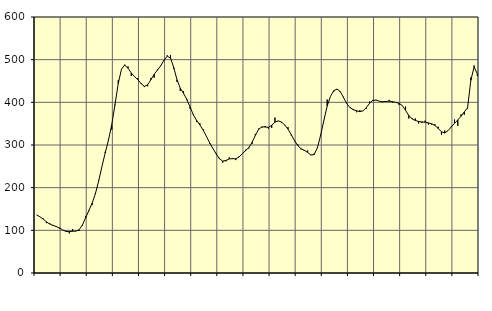
| Category | Piggar | Series 1 |
|---|---|---|
| nan | 136.1 | 135.94 |
| 87.0 | 131.9 | 131.87 |
| 87.0 | 127.9 | 126.28 |
| 87.0 | 116.8 | 119.91 |
| nan | 116.7 | 114.82 |
| 88.0 | 110.3 | 111.72 |
| 88.0 | 110.1 | 108.84 |
| 88.0 | 103.7 | 105.51 |
| nan | 101 | 100.97 |
| 89.0 | 98.9 | 97.38 |
| 89.0 | 92.9 | 96.98 |
| 89.0 | 103.1 | 97.82 |
| nan | 97.5 | 98.11 |
| 90.0 | 98.5 | 101.14 |
| 90.0 | 111.1 | 112.34 |
| 90.0 | 133.8 | 129.44 |
| nan | 147.4 | 146.35 |
| 91.0 | 159.2 | 163.51 |
| 91.0 | 187.8 | 185.89 |
| 91.0 | 216.3 | 215.57 |
| nan | 249.6 | 249.4 |
| 92.0 | 284.1 | 281.43 |
| 92.0 | 314 | 311.37 |
| 92.0 | 336.1 | 347.24 |
| nan | 393 | 394.89 |
| 93.0 | 451.7 | 444.25 |
| 93.0 | 477.9 | 477.86 |
| 93.0 | 488.2 | 487.33 |
| nan | 484.1 | 480.06 |
| 94.0 | 461.6 | 468.66 |
| 94.0 | 461 | 460.13 |
| 94.0 | 456.4 | 453.19 |
| nan | 445.2 | 443.91 |
| 95.0 | 435.7 | 437.53 |
| 95.0 | 437.6 | 441.12 |
| 95.0 | 457 | 453.09 |
| nan | 457.7 | 465.75 |
| 96.0 | 477.5 | 475.47 |
| 96.0 | 484.8 | 485.62 |
| 96.0 | 497.3 | 498.37 |
| nan | 510.1 | 508.2 |
| 97.0 | 511 | 503.9 |
| 97.0 | 478.4 | 481.43 |
| 97.0 | 448.1 | 452.93 |
| nan | 426.6 | 433.16 |
| 98.0 | 426 | 420.98 |
| 98.0 | 405 | 407.01 |
| 98.0 | 384.9 | 389.13 |
| nan | 372.1 | 370.88 |
| 99.0 | 354.1 | 357.81 |
| 99.0 | 350.8 | 347.02 |
| 99.0 | 336.7 | 335.11 |
| nan | 319.5 | 320.44 |
| 0.0 | 303 | 305.16 |
| 0.0 | 291.4 | 291.72 |
| 0.0 | 280.2 | 279.05 |
| nan | 269.7 | 267.75 |
| 1.0 | 258.7 | 262.21 |
| 1.0 | 261.8 | 263.77 |
| 1.0 | 271 | 267.39 |
| nan | 269.2 | 267.92 |
| 2.0 | 264.6 | 267.63 |
| 2.0 | 272.9 | 271.91 |
| 2.0 | 279.9 | 279.7 |
| nan | 288.9 | 286.79 |
| 3.0 | 291.8 | 294.08 |
| 3.0 | 302.7 | 306.22 |
| 3.0 | 326 | 322.69 |
| nan | 338.5 | 336.52 |
| 4.0 | 340.8 | 342.62 |
| 4.0 | 344.6 | 342.11 |
| 4.0 | 338.5 | 341.41 |
| nan | 340.1 | 346.24 |
| 5.0 | 364.2 | 353.54 |
| 5.0 | 356.1 | 356.57 |
| 5.0 | 352.3 | 353.71 |
| nan | 346.1 | 347.05 |
| 6.0 | 341.8 | 337.18 |
| 6.0 | 322.2 | 324.04 |
| 6.0 | 309 | 310.2 |
| nan | 301.6 | 298.57 |
| 7.0 | 289.6 | 291.31 |
| 7.0 | 286 | 287.56 |
| 7.0 | 287.3 | 282.61 |
| nan | 276.1 | 276.56 |
| 8.0 | 279.6 | 277.56 |
| 8.0 | 294.6 | 293.38 |
| 8.0 | 321.8 | 323.25 |
| nan | 358.8 | 358.15 |
| 9.0 | 406.6 | 391.38 |
| 9.0 | 414 | 414.07 |
| 9.0 | 424.4 | 427.14 |
| nan | 430.5 | 431.27 |
| 10.0 | 426.2 | 425.28 |
| 10.0 | 412.9 | 411.47 |
| 10.0 | 396.1 | 397.08 |
| nan | 386.6 | 387.58 |
| 11.0 | 384.5 | 382.69 |
| 11.0 | 376.8 | 380.12 |
| 11.0 | 381.6 | 378.28 |
| nan | 380 | 380.02 |
| 12.0 | 384.9 | 387.85 |
| 12.0 | 402 | 398 |
| 12.0 | 405.7 | 404.79 |
| nan | 405.7 | 405.18 |
| 13.0 | 402.7 | 402.56 |
| 13.0 | 400.2 | 401.44 |
| 13.0 | 401.5 | 402.01 |
| nan | 405.7 | 402.56 |
| 14.0 | 399.6 | 401.63 |
| 14.0 | 399.5 | 399.8 |
| 14.0 | 394.2 | 397.97 |
| nan | 392.8 | 392.37 |
| 15.0 | 390.2 | 381.37 |
| 15.0 | 362.2 | 369.24 |
| 15.0 | 362.8 | 361.2 |
| nan | 362.1 | 357.41 |
| 16.0 | 350.6 | 355.24 |
| 16.0 | 351.5 | 354.07 |
| 16.0 | 357.1 | 353.41 |
| nan | 348 | 351.76 |
| 17.0 | 347.5 | 349.59 |
| 17.0 | 348.8 | 345.93 |
| 17.0 | 342.8 | 338.79 |
| nan | 323.3 | 330.83 |
| 18.0 | 334 | 328.24 |
| 18.0 | 333.6 | 333.43 |
| 18.0 | 343.5 | 342.27 |
| nan | 359.7 | 350.63 |
| 19.0 | 345 | 358.74 |
| 19.0 | 371.7 | 367.28 |
| 19.0 | 370.9 | 377.61 |
| nan | 385.2 | 387.16 |
| 20.0 | 457.9 | 451.65 |
| 20.0 | 486.4 | 482.91 |
| 20.0 | 461.6 | 466.54 |